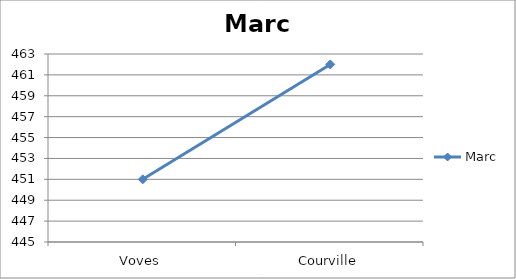
| Category | Marc |
|---|---|
| Voves | 451 |
| Courville | 462 |